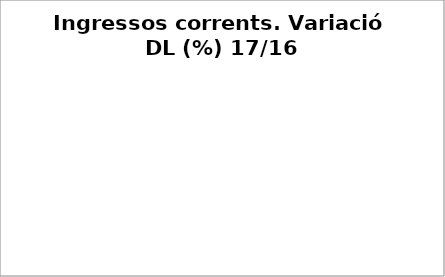
| Category | Series 0 |
|---|---|
| Impostos locals | 0.017 |
| Participació Tributs de l'Estat | 0.148 |
| Taxes i altres ingressos | -0.064 |
| Transferències corrents (exc. FCF) | -0.083 |
| Ingressos patrimonials | 0.044 |
| Ingressos corrents | 0.062 |